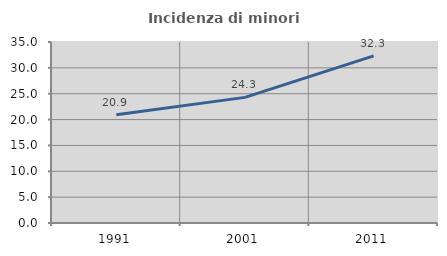
| Category | Incidenza di minori stranieri |
|---|---|
| 1991.0 | 20.93 |
| 2001.0 | 24.291 |
| 2011.0 | 32.31 |